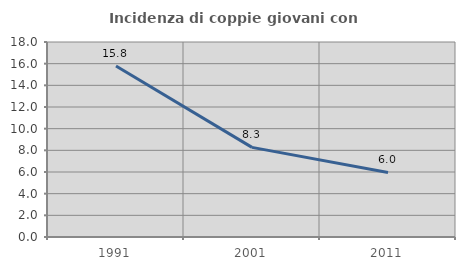
| Category | Incidenza di coppie giovani con figli |
|---|---|
| 1991.0 | 15.782 |
| 2001.0 | 8.275 |
| 2011.0 | 5.959 |